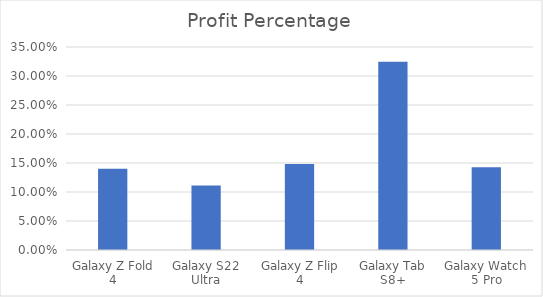
| Category | Profit Percentage |
|---|---|
| Galaxy Z Fold 4 | 0.14 |
| Galaxy S22 Ultra | 0.111 |
| Galaxy Z Flip 4 | 0.148 |
| Galaxy Tab S8+ | 0.325 |
| Galaxy Watch 5 Pro | 0.143 |